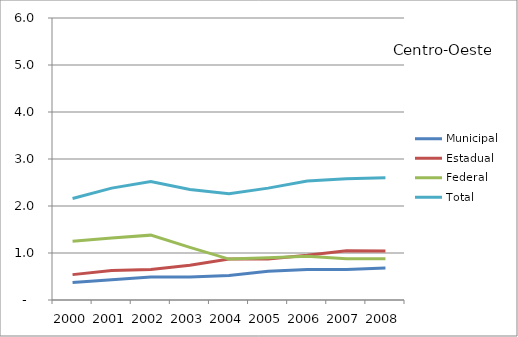
| Category | Municipal | Estadual | Federal | Total |
|---|---|---|---|---|
| 2000.0 | 0.37 | 0.54 | 1.25 | 2.16 |
| 2001.0 | 0.43 | 0.63 | 1.32 | 2.38 |
| 2002.0 | 0.49 | 0.65 | 1.38 | 2.52 |
| 2003.0 | 0.49 | 0.74 | 1.12 | 2.35 |
| 2004.0 | 0.52 | 0.87 | 0.87 | 2.26 |
| 2005.0 | 0.61 | 0.87 | 0.9 | 2.38 |
| 2006.0 | 0.65 | 0.95 | 0.93 | 2.53 |
| 2007.0 | 0.65 | 1.05 | 0.88 | 2.58 |
| 2008.0 | 0.68 | 1.04 | 0.88 | 2.6 |